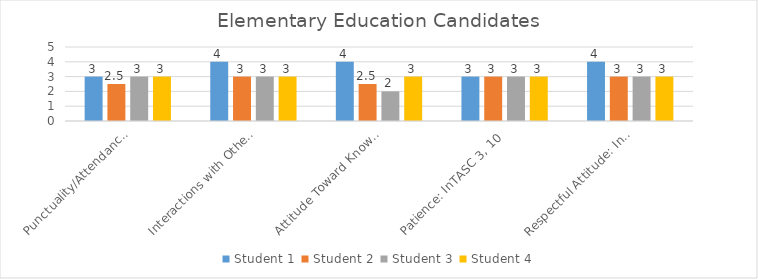
| Category | Student 1 | Student 2 | Student 3 | Student 4 |
|---|---|---|---|---|
| Punctuality/Attendance: InTASC 1, 9 | 3 | 2.5 | 3 | 3 |
| Interactions with Others: InTASC 3, 7, 10 | 4 | 3 | 3 | 3 |
| Attitude Toward Knowledge and Learning: InTASC 1, 4, 5, 9, 10 | 4 | 2.5 | 2 | 3 |
| Patience: InTASC 3, 10 | 3 | 3 | 3 | 3 |
| Respectful Attitude: InTASC 3, 7, 10 | 4 | 3 | 3 | 3 |